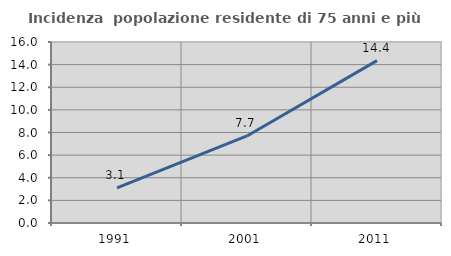
| Category | Incidenza  popolazione residente di 75 anni e più |
|---|---|
| 1991.0 | 3.109 |
| 2001.0 | 7.692 |
| 2011.0 | 14.356 |